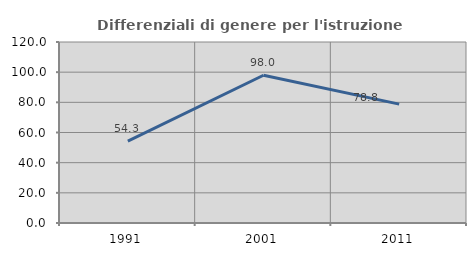
| Category | Differenziali di genere per l'istruzione superiore |
|---|---|
| 1991.0 | 54.322 |
| 2001.0 | 97.958 |
| 2011.0 | 78.83 |